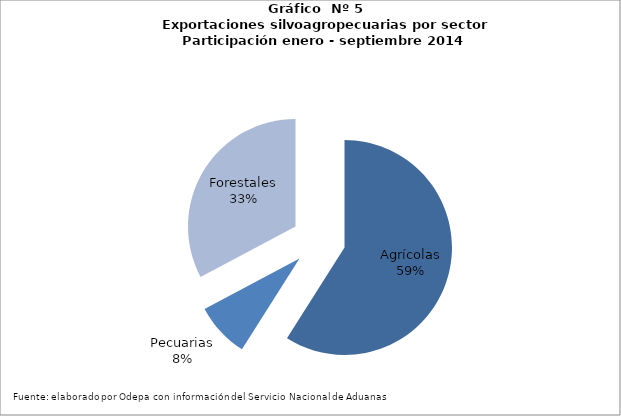
| Category | Series 0 |
|---|---|
| Agrícolas | 7224180 |
| Pecuarias | 1009073 |
| Forestales | 4013392 |